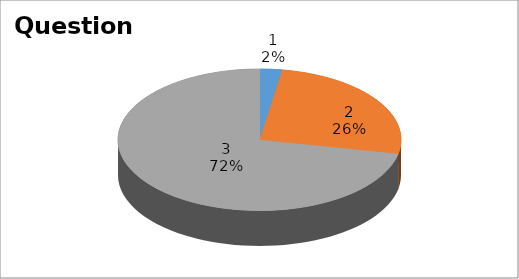
| Category | Series 0 |
|---|---|
| 0 | 1 |
| 1 | 10 |
| 2 | 28 |